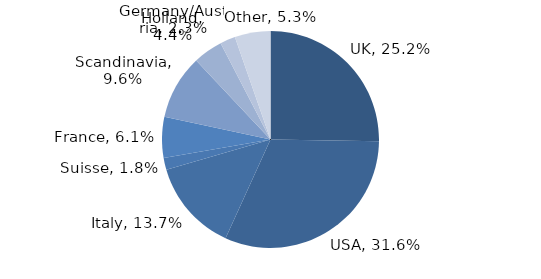
| Category | Investment Style |
|---|---|
| UK | 0.252 |
| USA | 0.316 |
| Italy | 0.137 |
| Suisse | 0.018 |
| France | 0.061 |
| Scandinavia | 0.096 |
| Holland | 0.044 |
| Germany/Austria | 0.023 |
| Other | 0.053 |